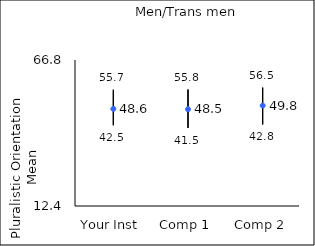
| Category | 25th percentile | 75th percentile | Mean |
|---|---|---|---|
| Your Inst | 42.5 | 55.7 | 48.59 |
| Comp 1 | 41.5 | 55.8 | 48.46 |
| Comp 2 | 42.8 | 56.5 | 49.81 |